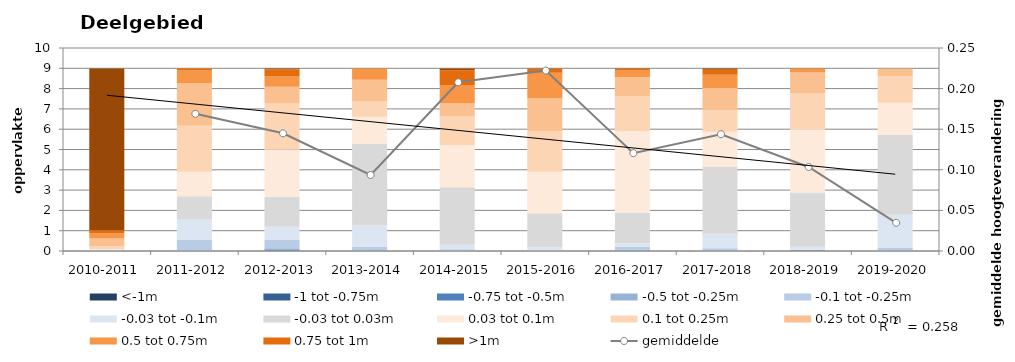
| Category | <-1m | -1 tot -0.75m | -0.75 tot -0.5m | -0.5 tot -0.25m | -0.1 tot -0.25m | -0.03 tot -0.1m | -0.03 tot 0.03m | 0.03 tot 0.1m | 0.1 tot 0.25m | 0.25 tot 0.5m | 0.5 tot 0.75m | 0.75 tot 1m | >1m |
|---|---|---|---|---|---|---|---|---|---|---|---|---|---|
| 2010-2011 | 0 | 0 | 0.004 | 0.012 | 0.018 | 0.015 | 0.019 | 0.031 | 0.13 | 0.389 | 0.248 | 0.154 | 7.967 |
| 2011-2012 | 0 | 0.001 | 0.002 | 0.012 | 0.547 | 0.994 | 1.14 | 1.21 | 2.258 | 2.109 | 0.623 | 0.088 | 0.005 |
| 2012-2013 | 0.002 | 0.004 | 0.026 | 0.111 | 0.396 | 0.658 | 1.474 | 2.331 | 2.261 | 0.832 | 0.498 | 0.358 | 0.04 |
| 2013-2014 | 0 | 0 | 0 | 0.041 | 0.151 | 1.07 | 4.023 | 1.326 | 0.758 | 1.07 | 0.536 | 0.014 | 0 |
| 2014-2015 | 0 | 0 | 0 | 0.012 | 0.077 | 0.22 | 2.835 | 2.068 | 1.43 | 0.652 | 0.886 | 0.724 | 0.087 |
| 2015-2016 | 0 | 0 | 0 | 0 | 0.043 | 0.14 | 1.676 | 2.043 | 1.994 | 1.634 | 1.248 | 0.2 | 0.012 |
| 2016-2017 | 0 | 0 | 0.004 | 0.072 | 0.129 | 0.182 | 1.514 | 3.996 | 1.743 | 0.924 | 0.358 | 0.062 | 0.006 |
| 2017-2018 | 0 | 0 | 0 | 0.014 | 0.124 | 0.714 | 3.282 | 1.735 | 1.092 | 1.068 | 0.651 | 0.251 | 0.058 |
| 2018-2019 | 0.016 | 0.004 | 0.006 | 0.008 | 0.021 | 0.154 | 2.676 | 3.114 | 1.762 | 1.031 | 0.18 | 0.017 | 0 |
| 2019-2020 | 0 | 0 | 0 | 0.016 | 0.127 | 1.639 | 3.95 | 1.571 | 1.296 | 0.377 | 0.015 | 0 | 0 |